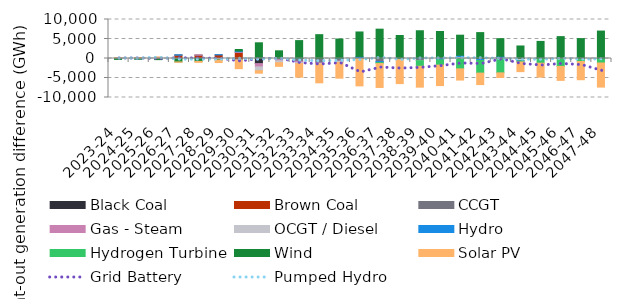
| Category | Black Coal | Brown Coal | CCGT | Gas - Steam | OCGT / Diesel | Hydro | Hydrogen Turbine | Wind | Solar PV |
|---|---|---|---|---|---|---|---|---|---|
| 2023-24 | 97.358 | 90.208 | 15.712 | 0.091 | 1.397 | -41.464 | 0 | -190.513 | 27.461 |
| 2024-25 | 92.368 | 52.646 | -29.086 | -4.296 | -1.18 | -43.831 | 0 | -93.075 | 34.741 |
| 2025-26 | 170.732 | -200.014 | 25.759 | 102.001 | -17.758 | -11.059 | 0 | -60.634 | 99.553 |
| 2026-27 | 72.847 | 786.565 | 28.373 | -3.493 | -87.56 | 53.495 | 0 | -784.77 | -85.886 |
| 2027-28 | 119.882 | 705.875 | 51.008 | 37.139 | -39.48 | -1.519 | 0 | -699.682 | -251.222 |
| 2028-29 | 16.375 | 905.701 | -15.538 | -33.916 | -212.123 | 65.903 | 0 | -117.258 | -656.861 |
| 2029-30 | -303.767 | 1541.292 | -90.102 | 199.54 | -15.396 | 186.111 | 0 | 375.354 | -2199.419 |
| 2030-31 | -1276.822 | -0.056 | -61.75 | -816.264 | -961.525 | 65.538 | 0.004 | 3963.106 | -648.629 |
| 2031-32 | -26.062 | 0.006 | -265.909 | -280.991 | -512.157 | 50.185 | 0.004 | 1920.843 | -926.467 |
| 2032-33 | 0.112 | 0.006 | -744.034 | -302.477 | -260.388 | 119.646 | 0.004 | 4469.332 | -3477.678 |
| 2033-34 | 0.09 | 0.007 | -1117.852 | -143.05 | -138.015 | 0.065 | 0.003 | 6114.409 | -4834.268 |
| 2034-35 | 0.099 | 0.007 | -650.792 | -101.635 | -240.226 | 120.085 | 0.007 | 4873.76 | -4054.83 |
| 2035-36 | 0.078 | 0.008 | 32.69 | -19.007 | 22.584 | 480.765 | -43.635 | 6267.822 | -6950.186 |
| 2036-37 | 0.068 | 0.009 | -792.385 | 5.536 | 23.302 | -247.397 | -259.689 | 7491.021 | -6126.756 |
| 2037-38 | 0.064 | 0.008 | 22.999 | -52.137 | -8.575 | 88.652 | -213.396 | 5779.594 | -6161.848 |
| 2038-39 | 0.062 | 0.009 | -531.632 | -5.396 | -22.047 | 133.009 | -1440.254 | 6982.989 | -5350.523 |
| 2039-40 | 0.061 | 0.009 | 130.12 | 0 | 104.24 | -326.868 | -1369.338 | 6691.709 | -5252.742 |
| 2040-41 | 0.068 | 0.009 | 36.3 | 0 | 492.312 | 300.62 | -2657.487 | 5145.729 | -2871.287 |
| 2041-42 | 0.069 | 0.008 | -48.593 | 0 | -61.645 | -404.051 | -3228.198 | 6640.694 | -2946.435 |
| 2042-43 | 0.061 | 0.008 | 50.951 | 0 | 101.642 | 419.409 | -3688.238 | 4513.078 | -1184.409 |
| 2043-44 | 0.057 | 0.008 | -18.723 | 0 | -515.678 | -100.145 | -265.314 | 3211.097 | -2465.252 |
| 2044-45 | 0.049 | 0.007 | 5.19 | 0 | -10.344 | 115.702 | -1198.356 | 4259.088 | -3560.888 |
| 2045-46 | 0.039 | 0.002 | -10.704 | 0 | 5.53 | 212.698 | -2019.845 | 5389.575 | -3579.106 |
| 2046-47 | 0.037 | 0.003 | 0.865 | 0 | -71.43 | 68.845 | -701.38 | 5031.903 | -4666.407 |
| 2047-48 | 0.036 | 0 | 60.35 | 0 | -11.732 | -148.771 | -988.172 | 6974.642 | -6187.779 |